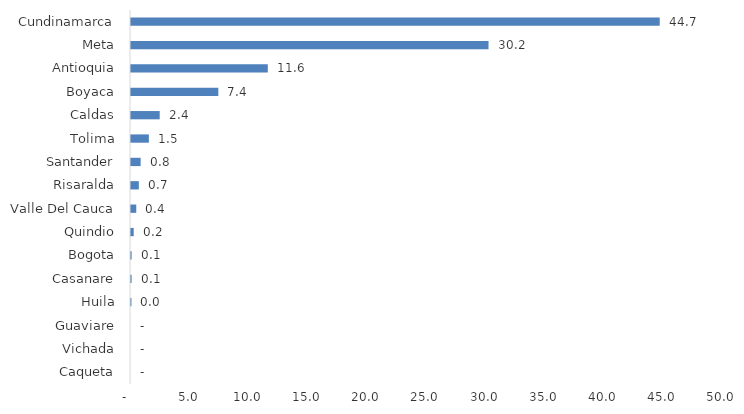
| Category | Series 0 |
|---|---|
| Caqueta | 0 |
| Vichada | 0 |
| Guaviare | 0 |
| Huila | 0.038 |
| Casanare | 0.051 |
| Bogota | 0.052 |
| Quindio | 0.228 |
| Valle Del Cauca | 0.444 |
| Risaralda | 0.661 |
| Santander | 0.814 |
| Tolima | 1.507 |
| Caldas | 2.423 |
| Boyaca | 7.375 |
| Antioquia | 11.554 |
| Meta | 30.197 |
| Cundinamarca | 44.657 |